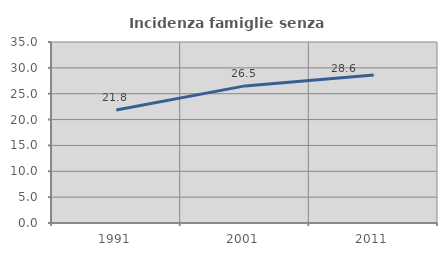
| Category | Incidenza famiglie senza nuclei |
|---|---|
| 1991.0 | 21.834 |
| 2001.0 | 26.512 |
| 2011.0 | 28.605 |